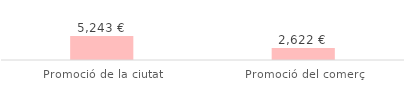
| Category | Total |
|---|---|
| Promoció de la ciutat | 5243.32 |
| Promoció del comerç | 2621.66 |